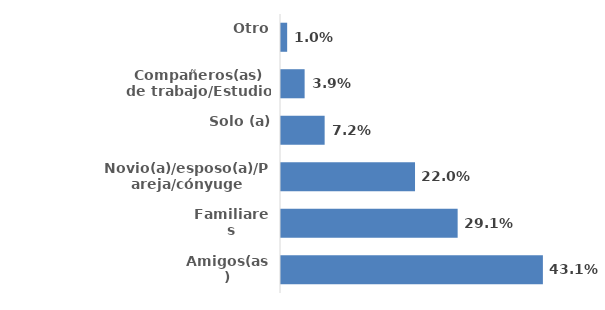
| Category | Series 0 |
|---|---|
| Amigos(as) | 0.431 |
| Familiares | 0.291 |
| Novio(a)/esposo(a)/Pareja/cónyuge | 0.22 |
| Solo (a) | 0.072 |
| Compañeros(as) de trabajo/Estudio | 0.039 |
| Otro | 0.01 |